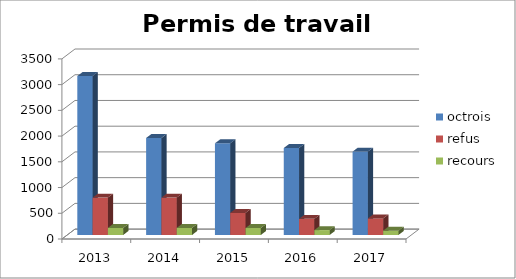
| Category | octrois | refus | recours |
|---|---|---|---|
| 2013.0 | 3089 | 726 | 137 |
| 2014.0 | 1885 | 726 | 137 |
| 2015.0 | 1781 | 429 | 135 |
| 2016.0 | 1690 | 313 | 95 |
| 2017.0 | 1620 | 322 | 84 |